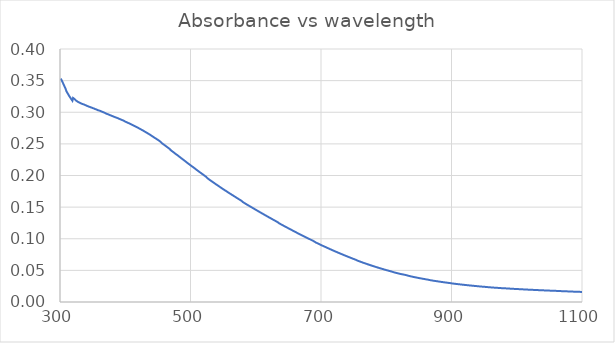
| Category | Series 0 |
|---|---|
| 1100.0 | 0.016 |
| 1099.0 | 0.016 |
| 1098.0 | 0.016 |
| 1097.0 | 0.016 |
| 1096.0 | 0.016 |
| 1095.0 | 0.016 |
| 1094.0 | 0.016 |
| 1093.0 | 0.016 |
| 1092.0 | 0.016 |
| 1091.0 | 0.016 |
| 1090.0 | 0.016 |
| 1089.0 | 0.016 |
| 1088.0 | 0.016 |
| 1087.0 | 0.016 |
| 1086.0 | 0.016 |
| 1085.0 | 0.016 |
| 1084.0 | 0.016 |
| 1083.0 | 0.017 |
| 1082.0 | 0.017 |
| 1081.0 | 0.017 |
| 1080.0 | 0.017 |
| 1079.0 | 0.017 |
| 1078.0 | 0.017 |
| 1077.0 | 0.017 |
| 1076.0 | 0.017 |
| 1075.0 | 0.017 |
| 1074.0 | 0.017 |
| 1073.0 | 0.017 |
| 1072.0 | 0.017 |
| 1071.0 | 0.017 |
| 1070.0 | 0.017 |
| 1069.0 | 0.017 |
| 1068.0 | 0.017 |
| 1067.0 | 0.017 |
| 1066.0 | 0.017 |
| 1065.0 | 0.017 |
| 1064.0 | 0.017 |
| 1063.0 | 0.017 |
| 1062.0 | 0.018 |
| 1061.0 | 0.018 |
| 1060.0 | 0.018 |
| 1059.0 | 0.018 |
| 1058.0 | 0.018 |
| 1057.0 | 0.018 |
| 1056.0 | 0.018 |
| 1055.0 | 0.018 |
| 1054.0 | 0.018 |
| 1053.0 | 0.018 |
| 1052.0 | 0.018 |
| 1051.0 | 0.018 |
| 1050.0 | 0.018 |
| 1049.0 | 0.018 |
| 1048.0 | 0.018 |
| 1047.0 | 0.018 |
| 1046.0 | 0.018 |
| 1045.0 | 0.018 |
| 1044.0 | 0.018 |
| 1043.0 | 0.018 |
| 1042.0 | 0.018 |
| 1041.0 | 0.018 |
| 1040.0 | 0.018 |
| 1039.0 | 0.019 |
| 1038.0 | 0.019 |
| 1037.0 | 0.019 |
| 1036.0 | 0.019 |
| 1035.0 | 0.019 |
| 1034.0 | 0.019 |
| 1033.0 | 0.019 |
| 1032.0 | 0.019 |
| 1031.0 | 0.019 |
| 1030.0 | 0.019 |
| 1029.0 | 0.019 |
| 1028.0 | 0.019 |
| 1027.0 | 0.019 |
| 1026.0 | 0.019 |
| 1025.0 | 0.019 |
| 1024.0 | 0.019 |
| 1023.0 | 0.019 |
| 1022.0 | 0.019 |
| 1021.0 | 0.019 |
| 1020.0 | 0.019 |
| 1019.0 | 0.019 |
| 1018.0 | 0.02 |
| 1017.0 | 0.02 |
| 1016.0 | 0.02 |
| 1015.0 | 0.02 |
| 1014.0 | 0.02 |
| 1013.0 | 0.02 |
| 1012.0 | 0.02 |
| 1011.0 | 0.02 |
| 1010.0 | 0.02 |
| 1009.0 | 0.02 |
| 1008.0 | 0.02 |
| 1007.0 | 0.02 |
| 1006.0 | 0.02 |
| 1005.0 | 0.02 |
| 1004.0 | 0.02 |
| 1003.0 | 0.02 |
| 1002.0 | 0.02 |
| 1001.0 | 0.02 |
| 1000.0 | 0.021 |
| 999.0 | 0.021 |
| 998.0 | 0.021 |
| 997.0 | 0.021 |
| 996.0 | 0.021 |
| 995.0 | 0.021 |
| 994.0 | 0.021 |
| 993.0 | 0.021 |
| 992.0 | 0.021 |
| 991.0 | 0.021 |
| 990.0 | 0.021 |
| 989.0 | 0.021 |
| 988.0 | 0.021 |
| 987.0 | 0.021 |
| 986.0 | 0.021 |
| 985.0 | 0.021 |
| 984.0 | 0.022 |
| 983.0 | 0.022 |
| 982.0 | 0.022 |
| 981.0 | 0.022 |
| 980.0 | 0.022 |
| 979.0 | 0.022 |
| 978.0 | 0.022 |
| 977.0 | 0.022 |
| 976.0 | 0.022 |
| 975.0 | 0.022 |
| 974.0 | 0.022 |
| 973.0 | 0.022 |
| 972.0 | 0.022 |
| 971.0 | 0.022 |
| 970.0 | 0.022 |
| 969.0 | 0.022 |
| 968.0 | 0.023 |
| 967.0 | 0.023 |
| 966.0 | 0.023 |
| 965.0 | 0.023 |
| 964.0 | 0.023 |
| 963.0 | 0.023 |
| 962.0 | 0.023 |
| 961.0 | 0.023 |
| 960.0 | 0.023 |
| 959.0 | 0.023 |
| 958.0 | 0.023 |
| 957.0 | 0.023 |
| 956.0 | 0.023 |
| 955.0 | 0.024 |
| 954.0 | 0.024 |
| 953.0 | 0.024 |
| 952.0 | 0.024 |
| 951.0 | 0.024 |
| 950.0 | 0.024 |
| 949.0 | 0.024 |
| 948.0 | 0.024 |
| 947.0 | 0.024 |
| 946.0 | 0.024 |
| 945.0 | 0.024 |
| 944.0 | 0.025 |
| 943.0 | 0.025 |
| 942.0 | 0.025 |
| 941.0 | 0.025 |
| 940.0 | 0.025 |
| 939.0 | 0.025 |
| 938.0 | 0.025 |
| 937.0 | 0.025 |
| 936.0 | 0.025 |
| 935.0 | 0.025 |
| 934.0 | 0.026 |
| 933.0 | 0.026 |
| 932.0 | 0.026 |
| 931.0 | 0.026 |
| 930.0 | 0.026 |
| 929.0 | 0.026 |
| 928.0 | 0.026 |
| 927.0 | 0.026 |
| 926.0 | 0.026 |
| 925.0 | 0.026 |
| 924.0 | 0.027 |
| 923.0 | 0.027 |
| 922.0 | 0.027 |
| 921.0 | 0.027 |
| 920.0 | 0.027 |
| 919.0 | 0.027 |
| 918.0 | 0.027 |
| 917.0 | 0.027 |
| 916.0 | 0.028 |
| 915.0 | 0.028 |
| 914.0 | 0.028 |
| 913.0 | 0.028 |
| 912.0 | 0.028 |
| 911.0 | 0.028 |
| 910.0 | 0.028 |
| 909.0 | 0.028 |
| 908.0 | 0.028 |
| 907.0 | 0.029 |
| 906.0 | 0.029 |
| 905.0 | 0.029 |
| 904.0 | 0.029 |
| 903.0 | 0.029 |
| 902.0 | 0.029 |
| 901.0 | 0.029 |
| 900.0 | 0.029 |
| 899.0 | 0.03 |
| 898.0 | 0.03 |
| 897.0 | 0.03 |
| 896.0 | 0.03 |
| 895.0 | 0.03 |
| 894.0 | 0.03 |
| 893.0 | 0.031 |
| 892.0 | 0.031 |
| 891.0 | 0.031 |
| 890.0 | 0.031 |
| 889.0 | 0.031 |
| 888.0 | 0.031 |
| 887.0 | 0.031 |
| 886.0 | 0.032 |
| 885.0 | 0.032 |
| 884.0 | 0.032 |
| 883.0 | 0.032 |
| 882.0 | 0.032 |
| 881.0 | 0.032 |
| 880.0 | 0.032 |
| 879.0 | 0.033 |
| 878.0 | 0.033 |
| 877.0 | 0.033 |
| 876.0 | 0.033 |
| 875.0 | 0.033 |
| 874.0 | 0.033 |
| 873.0 | 0.034 |
| 872.0 | 0.034 |
| 871.0 | 0.034 |
| 870.0 | 0.034 |
| 869.0 | 0.034 |
| 868.0 | 0.034 |
| 867.0 | 0.035 |
| 866.0 | 0.035 |
| 865.0 | 0.035 |
| 864.0 | 0.035 |
| 863.0 | 0.035 |
| 862.0 | 0.036 |
| 861.0 | 0.036 |
| 860.0 | 0.036 |
| 859.0 | 0.036 |
| 858.0 | 0.036 |
| 857.0 | 0.037 |
| 856.0 | 0.037 |
| 855.0 | 0.037 |
| 854.0 | 0.037 |
| 853.0 | 0.037 |
| 852.0 | 0.038 |
| 851.0 | 0.038 |
| 850.0 | 0.038 |
| 849.0 | 0.038 |
| 848.0 | 0.038 |
| 847.0 | 0.039 |
| 846.0 | 0.039 |
| 845.0 | 0.039 |
| 844.0 | 0.039 |
| 843.0 | 0.039 |
| 842.0 | 0.04 |
| 841.0 | 0.04 |
| 840.0 | 0.04 |
| 839.0 | 0.04 |
| 838.0 | 0.04 |
| 837.0 | 0.041 |
| 836.0 | 0.041 |
| 835.0 | 0.041 |
| 834.0 | 0.041 |
| 833.0 | 0.042 |
| 832.0 | 0.042 |
| 831.0 | 0.042 |
| 830.0 | 0.043 |
| 829.0 | 0.043 |
| 828.0 | 0.043 |
| 827.0 | 0.043 |
| 826.0 | 0.043 |
| 825.0 | 0.044 |
| 824.0 | 0.044 |
| 823.0 | 0.044 |
| 822.0 | 0.044 |
| 821.0 | 0.045 |
| 820.0 | 0.045 |
| 819.0 | 0.045 |
| 818.0 | 0.045 |
| 817.0 | 0.046 |
| 816.0 | 0.046 |
| 815.0 | 0.046 |
| 814.0 | 0.046 |
| 813.0 | 0.047 |
| 812.0 | 0.047 |
| 811.0 | 0.047 |
| 810.0 | 0.048 |
| 809.0 | 0.048 |
| 808.0 | 0.048 |
| 807.0 | 0.048 |
| 806.0 | 0.049 |
| 805.0 | 0.049 |
| 804.0 | 0.049 |
| 803.0 | 0.05 |
| 802.0 | 0.05 |
| 801.0 | 0.05 |
| 800.0 | 0.05 |
| 799.0 | 0.051 |
| 798.0 | 0.051 |
| 797.0 | 0.051 |
| 796.0 | 0.052 |
| 795.0 | 0.052 |
| 794.0 | 0.052 |
| 793.0 | 0.053 |
| 792.0 | 0.053 |
| 791.0 | 0.053 |
| 790.0 | 0.054 |
| 789.0 | 0.054 |
| 788.0 | 0.054 |
| 787.0 | 0.054 |
| 786.0 | 0.055 |
| 785.0 | 0.055 |
| 784.0 | 0.055 |
| 783.0 | 0.056 |
| 782.0 | 0.056 |
| 781.0 | 0.056 |
| 780.0 | 0.057 |
| 779.0 | 0.057 |
| 778.0 | 0.057 |
| 777.0 | 0.058 |
| 776.0 | 0.058 |
| 775.0 | 0.058 |
| 774.0 | 0.059 |
| 773.0 | 0.059 |
| 772.0 | 0.06 |
| 771.0 | 0.06 |
| 770.0 | 0.06 |
| 769.0 | 0.061 |
| 768.0 | 0.061 |
| 767.0 | 0.061 |
| 766.0 | 0.062 |
| 765.0 | 0.062 |
| 764.0 | 0.062 |
| 763.0 | 0.063 |
| 762.0 | 0.063 |
| 761.0 | 0.063 |
| 760.0 | 0.064 |
| 759.0 | 0.064 |
| 758.0 | 0.065 |
| 757.0 | 0.065 |
| 756.0 | 0.065 |
| 755.0 | 0.066 |
| 754.0 | 0.066 |
| 753.0 | 0.067 |
| 752.0 | 0.067 |
| 751.0 | 0.068 |
| 750.0 | 0.068 |
| 749.0 | 0.068 |
| 748.0 | 0.069 |
| 747.0 | 0.069 |
| 746.0 | 0.07 |
| 745.0 | 0.07 |
| 744.0 | 0.07 |
| 743.0 | 0.071 |
| 742.0 | 0.071 |
| 741.0 | 0.072 |
| 740.0 | 0.072 |
| 739.0 | 0.073 |
| 738.0 | 0.073 |
| 737.0 | 0.073 |
| 736.0 | 0.074 |
| 735.0 | 0.074 |
| 734.0 | 0.075 |
| 733.0 | 0.075 |
| 732.0 | 0.076 |
| 731.0 | 0.076 |
| 730.0 | 0.076 |
| 729.0 | 0.077 |
| 728.0 | 0.077 |
| 727.0 | 0.078 |
| 726.0 | 0.078 |
| 725.0 | 0.079 |
| 724.0 | 0.079 |
| 723.0 | 0.079 |
| 722.0 | 0.08 |
| 721.0 | 0.08 |
| 720.0 | 0.081 |
| 719.0 | 0.081 |
| 718.0 | 0.082 |
| 717.0 | 0.082 |
| 716.0 | 0.083 |
| 715.0 | 0.083 |
| 714.0 | 0.084 |
| 713.0 | 0.084 |
| 712.0 | 0.084 |
| 711.0 | 0.085 |
| 710.0 | 0.085 |
| 709.0 | 0.086 |
| 708.0 | 0.086 |
| 707.0 | 0.087 |
| 706.0 | 0.087 |
| 705.0 | 0.088 |
| 704.0 | 0.088 |
| 703.0 | 0.089 |
| 702.0 | 0.089 |
| 701.0 | 0.09 |
| 700.0 | 0.09 |
| 699.0 | 0.091 |
| 698.0 | 0.091 |
| 697.0 | 0.092 |
| 696.0 | 0.092 |
| 695.0 | 0.093 |
| 694.0 | 0.093 |
| 693.0 | 0.094 |
| 692.0 | 0.094 |
| 691.0 | 0.095 |
| 690.0 | 0.095 |
| 689.0 | 0.096 |
| 688.0 | 0.097 |
| 687.0 | 0.097 |
| 686.0 | 0.098 |
| 685.0 | 0.098 |
| 684.0 | 0.099 |
| 683.0 | 0.099 |
| 682.0 | 0.1 |
| 681.0 | 0.1 |
| 680.0 | 0.101 |
| 679.0 | 0.101 |
| 678.0 | 0.102 |
| 677.0 | 0.102 |
| 676.0 | 0.103 |
| 675.0 | 0.103 |
| 674.0 | 0.104 |
| 673.0 | 0.104 |
| 672.0 | 0.105 |
| 671.0 | 0.105 |
| 670.0 | 0.106 |
| 669.0 | 0.106 |
| 668.0 | 0.107 |
| 667.0 | 0.107 |
| 666.0 | 0.108 |
| 665.0 | 0.108 |
| 664.0 | 0.109 |
| 663.0 | 0.11 |
| 662.0 | 0.11 |
| 661.0 | 0.111 |
| 660.0 | 0.111 |
| 659.0 | 0.112 |
| 658.0 | 0.112 |
| 657.0 | 0.113 |
| 656.0 | 0.113 |
| 655.0 | 0.114 |
| 654.0 | 0.114 |
| 653.0 | 0.115 |
| 652.0 | 0.116 |
| 651.0 | 0.116 |
| 650.0 | 0.117 |
| 649.0 | 0.117 |
| 648.0 | 0.118 |
| 647.0 | 0.118 |
| 646.0 | 0.119 |
| 645.0 | 0.119 |
| 644.0 | 0.12 |
| 643.0 | 0.12 |
| 642.0 | 0.121 |
| 641.0 | 0.122 |
| 640.0 | 0.122 |
| 639.0 | 0.123 |
| 638.0 | 0.123 |
| 637.0 | 0.124 |
| 636.0 | 0.124 |
| 635.0 | 0.125 |
| 634.0 | 0.126 |
| 633.0 | 0.127 |
| 632.0 | 0.127 |
| 631.0 | 0.128 |
| 630.0 | 0.128 |
| 629.0 | 0.129 |
| 628.0 | 0.129 |
| 627.0 | 0.13 |
| 626.0 | 0.131 |
| 625.0 | 0.131 |
| 624.0 | 0.132 |
| 623.0 | 0.132 |
| 622.0 | 0.133 |
| 621.0 | 0.133 |
| 620.0 | 0.134 |
| 619.0 | 0.135 |
| 618.0 | 0.135 |
| 617.0 | 0.136 |
| 616.0 | 0.136 |
| 615.0 | 0.137 |
| 614.0 | 0.138 |
| 613.0 | 0.138 |
| 612.0 | 0.139 |
| 611.0 | 0.139 |
| 610.0 | 0.14 |
| 609.0 | 0.14 |
| 608.0 | 0.141 |
| 607.0 | 0.142 |
| 606.0 | 0.142 |
| 605.0 | 0.143 |
| 604.0 | 0.143 |
| 603.0 | 0.144 |
| 602.0 | 0.145 |
| 601.0 | 0.145 |
| 600.0 | 0.146 |
| 599.0 | 0.146 |
| 598.0 | 0.147 |
| 597.0 | 0.148 |
| 596.0 | 0.148 |
| 595.0 | 0.149 |
| 594.0 | 0.15 |
| 593.0 | 0.15 |
| 592.0 | 0.151 |
| 591.0 | 0.151 |
| 590.0 | 0.152 |
| 589.0 | 0.153 |
| 588.0 | 0.153 |
| 587.0 | 0.154 |
| 586.0 | 0.154 |
| 585.0 | 0.155 |
| 584.0 | 0.156 |
| 583.0 | 0.156 |
| 582.0 | 0.157 |
| 581.0 | 0.157 |
| 580.0 | 0.158 |
| 579.0 | 0.159 |
| 578.0 | 0.16 |
| 577.0 | 0.161 |
| 576.0 | 0.161 |
| 575.0 | 0.162 |
| 574.0 | 0.163 |
| 573.0 | 0.163 |
| 572.0 | 0.164 |
| 571.0 | 0.165 |
| 570.0 | 0.165 |
| 569.0 | 0.166 |
| 568.0 | 0.167 |
| 567.0 | 0.167 |
| 566.0 | 0.168 |
| 565.0 | 0.168 |
| 564.0 | 0.169 |
| 563.0 | 0.17 |
| 562.0 | 0.17 |
| 561.0 | 0.171 |
| 560.0 | 0.172 |
| 559.0 | 0.172 |
| 558.0 | 0.173 |
| 557.0 | 0.174 |
| 556.0 | 0.174 |
| 555.0 | 0.175 |
| 554.0 | 0.176 |
| 553.0 | 0.176 |
| 552.0 | 0.177 |
| 551.0 | 0.178 |
| 550.0 | 0.178 |
| 549.0 | 0.179 |
| 548.0 | 0.18 |
| 547.0 | 0.181 |
| 546.0 | 0.181 |
| 545.0 | 0.182 |
| 544.0 | 0.183 |
| 543.0 | 0.183 |
| 542.0 | 0.184 |
| 541.0 | 0.185 |
| 540.0 | 0.185 |
| 539.0 | 0.186 |
| 538.0 | 0.187 |
| 537.0 | 0.188 |
| 536.0 | 0.188 |
| 535.0 | 0.189 |
| 534.0 | 0.19 |
| 533.0 | 0.19 |
| 532.0 | 0.191 |
| 531.0 | 0.192 |
| 530.0 | 0.193 |
| 529.0 | 0.193 |
| 528.0 | 0.194 |
| 527.0 | 0.195 |
| 526.0 | 0.196 |
| 525.0 | 0.197 |
| 524.0 | 0.198 |
| 523.0 | 0.199 |
| 522.0 | 0.199 |
| 521.0 | 0.2 |
| 520.0 | 0.201 |
| 519.0 | 0.202 |
| 518.0 | 0.202 |
| 517.0 | 0.203 |
| 516.0 | 0.204 |
| 515.0 | 0.205 |
| 514.0 | 0.205 |
| 513.0 | 0.206 |
| 512.0 | 0.207 |
| 511.0 | 0.208 |
| 510.0 | 0.208 |
| 509.0 | 0.209 |
| 508.0 | 0.21 |
| 507.0 | 0.211 |
| 506.0 | 0.212 |
| 505.0 | 0.212 |
| 504.0 | 0.213 |
| 503.0 | 0.214 |
| 502.0 | 0.215 |
| 501.0 | 0.215 |
| 500.0 | 0.216 |
| 499.0 | 0.217 |
| 498.0 | 0.218 |
| 497.0 | 0.219 |
| 496.0 | 0.219 |
| 495.0 | 0.22 |
| 494.0 | 0.221 |
| 493.0 | 0.222 |
| 492.0 | 0.223 |
| 491.0 | 0.223 |
| 490.0 | 0.224 |
| 489.0 | 0.225 |
| 488.0 | 0.226 |
| 487.0 | 0.226 |
| 486.0 | 0.227 |
| 485.0 | 0.228 |
| 484.0 | 0.229 |
| 483.0 | 0.23 |
| 482.0 | 0.23 |
| 481.0 | 0.231 |
| 480.0 | 0.232 |
| 479.0 | 0.233 |
| 478.0 | 0.234 |
| 477.0 | 0.234 |
| 476.0 | 0.235 |
| 475.0 | 0.236 |
| 474.0 | 0.237 |
| 473.0 | 0.237 |
| 472.0 | 0.238 |
| 471.0 | 0.239 |
| 470.0 | 0.24 |
| 469.0 | 0.241 |
| 468.0 | 0.242 |
| 467.0 | 0.243 |
| 466.0 | 0.244 |
| 465.0 | 0.244 |
| 464.0 | 0.245 |
| 463.0 | 0.246 |
| 462.0 | 0.247 |
| 461.0 | 0.247 |
| 460.0 | 0.248 |
| 459.0 | 0.249 |
| 458.0 | 0.25 |
| 457.0 | 0.25 |
| 456.0 | 0.251 |
| 455.0 | 0.252 |
| 454.0 | 0.253 |
| 453.0 | 0.254 |
| 452.0 | 0.255 |
| 451.0 | 0.256 |
| 450.0 | 0.256 |
| 449.0 | 0.257 |
| 448.0 | 0.258 |
| 447.0 | 0.258 |
| 446.0 | 0.259 |
| 445.0 | 0.26 |
| 444.0 | 0.26 |
| 443.0 | 0.261 |
| 442.0 | 0.262 |
| 441.0 | 0.262 |
| 440.0 | 0.263 |
| 439.0 | 0.264 |
| 438.0 | 0.264 |
| 437.0 | 0.265 |
| 436.0 | 0.266 |
| 435.0 | 0.266 |
| 434.0 | 0.267 |
| 433.0 | 0.268 |
| 432.0 | 0.268 |
| 431.0 | 0.269 |
| 430.0 | 0.269 |
| 429.0 | 0.27 |
| 428.0 | 0.271 |
| 427.0 | 0.271 |
| 426.0 | 0.272 |
| 425.0 | 0.272 |
| 424.0 | 0.273 |
| 423.0 | 0.273 |
| 422.0 | 0.274 |
| 421.0 | 0.275 |
| 420.0 | 0.275 |
| 419.0 | 0.276 |
| 418.0 | 0.276 |
| 417.0 | 0.277 |
| 416.0 | 0.277 |
| 415.0 | 0.278 |
| 414.0 | 0.278 |
| 413.0 | 0.279 |
| 412.0 | 0.279 |
| 411.0 | 0.28 |
| 410.0 | 0.28 |
| 409.0 | 0.281 |
| 408.0 | 0.281 |
| 407.0 | 0.282 |
| 406.0 | 0.282 |
| 405.0 | 0.283 |
| 404.0 | 0.283 |
| 403.0 | 0.284 |
| 402.0 | 0.284 |
| 401.0 | 0.285 |
| 400.0 | 0.285 |
| 399.0 | 0.286 |
| 398.0 | 0.286 |
| 397.0 | 0.287 |
| 396.0 | 0.287 |
| 395.0 | 0.288 |
| 394.0 | 0.288 |
| 393.0 | 0.289 |
| 392.0 | 0.289 |
| 391.0 | 0.29 |
| 390.0 | 0.29 |
| 389.0 | 0.29 |
| 388.0 | 0.291 |
| 387.0 | 0.291 |
| 386.0 | 0.292 |
| 385.0 | 0.292 |
| 384.0 | 0.292 |
| 383.0 | 0.293 |
| 382.0 | 0.293 |
| 381.0 | 0.294 |
| 380.0 | 0.294 |
| 379.0 | 0.294 |
| 378.0 | 0.295 |
| 377.0 | 0.295 |
| 376.0 | 0.296 |
| 375.0 | 0.296 |
| 374.0 | 0.297 |
| 373.0 | 0.297 |
| 372.0 | 0.297 |
| 371.0 | 0.298 |
| 370.0 | 0.298 |
| 369.0 | 0.299 |
| 368.0 | 0.299 |
| 367.0 | 0.3 |
| 366.0 | 0.3 |
| 365.0 | 0.3 |
| 364.0 | 0.301 |
| 363.0 | 0.301 |
| 362.0 | 0.302 |
| 361.0 | 0.302 |
| 360.0 | 0.303 |
| 359.0 | 0.303 |
| 358.0 | 0.303 |
| 357.0 | 0.304 |
| 356.0 | 0.304 |
| 355.0 | 0.305 |
| 354.0 | 0.305 |
| 353.0 | 0.305 |
| 352.0 | 0.306 |
| 351.0 | 0.306 |
| 350.0 | 0.307 |
| 349.0 | 0.307 |
| 348.0 | 0.308 |
| 347.0 | 0.308 |
| 346.0 | 0.308 |
| 345.0 | 0.309 |
| 344.0 | 0.309 |
| 343.0 | 0.309 |
| 342.0 | 0.31 |
| 341.0 | 0.31 |
| 340.0 | 0.311 |
| 339.0 | 0.311 |
| 338.0 | 0.312 |
| 337.0 | 0.312 |
| 336.0 | 0.312 |
| 335.0 | 0.313 |
| 334.0 | 0.313 |
| 333.0 | 0.314 |
| 332.0 | 0.314 |
| 331.0 | 0.315 |
| 330.0 | 0.315 |
| 329.0 | 0.316 |
| 328.0 | 0.316 |
| 327.0 | 0.317 |
| 326.0 | 0.317 |
| 325.0 | 0.319 |
| 324.0 | 0.319 |
| 323.0 | 0.319 |
| 322.0 | 0.321 |
| 321.0 | 0.322 |
| 320.0 | 0.323 |
| 319.0 | 0.318 |
| 318.0 | 0.32 |
| 317.0 | 0.321 |
| 316.0 | 0.323 |
| 315.0 | 0.324 |
| 314.0 | 0.326 |
| 313.0 | 0.328 |
| 312.0 | 0.329 |
| 311.0 | 0.331 |
| 310.0 | 0.333 |
| 309.0 | 0.336 |
| 308.0 | 0.339 |
| 307.0 | 0.341 |
| 306.0 | 0.343 |
| 305.0 | 0.345 |
| 304.0 | 0.347 |
| 303.0 | 0.35 |
| 302.0 | 0.352 |
| 301.0 | 0.353 |